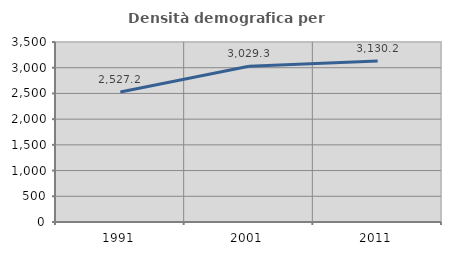
| Category | Densità demografica |
|---|---|
| 1991.0 | 2527.215 |
| 2001.0 | 3029.312 |
| 2011.0 | 3130.181 |